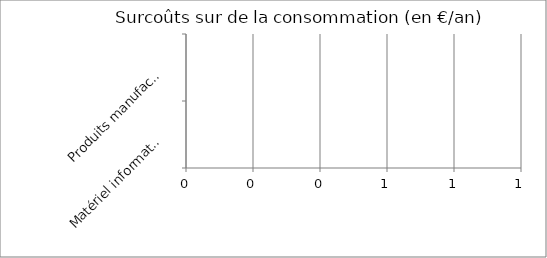
| Category | Series 0 |
|---|---|
| Matériel informatique/électronique  | 0 |
| Produits manufacturés (vêtements, livres, mobilier, électroménager, etc.) | 0 |